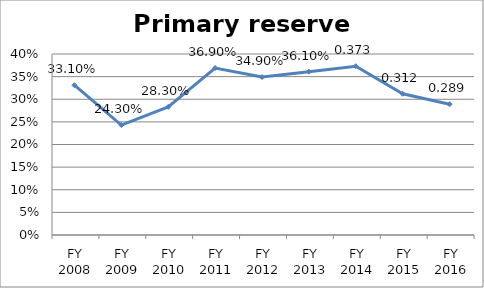
| Category | Primary reserve ratio |
|---|---|
| FY 2016 | 0.289 |
| FY 2015 | 0.312 |
| FY 2014 | 0.373 |
| FY 2013 | 0.361 |
| FY 2012 | 0.349 |
| FY 2011 | 0.369 |
| FY 2010 | 0.283 |
| FY 2009 | 0.243 |
| FY 2008 | 0.331 |